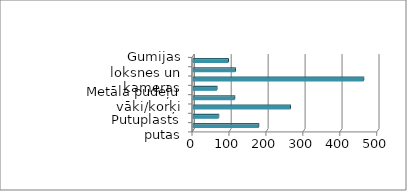
| Category | Series 0 |
|---|---|
| Putuplasts putas | 178 |
| Auduma virves un šņores | 70 |
| Stikla un keramikas gabali | 264 |
| Metāla pudeļu vāki/korķi | 113 |
| Alumīnija skārdenes | 65 |
| Papīra iepakojums | 462 |
| Gumijas loksnes un kameras | 115 |
| Azbesta šīferis un būvmateriāli  | 96 |